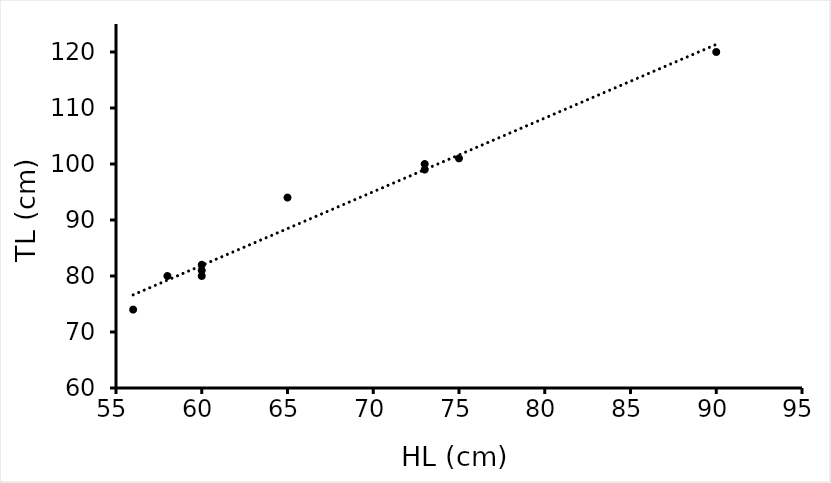
| Category | TL |
|---|---|
| 75.0 | 101 |
| 73.0 | 99 |
| 73.0 | 100 |
| 65.0 | 94 |
| 56.0 | 74 |
| 90.0 | 120 |
| 58.0 | 80 |
| 60.0 | 80 |
| 60.0 | 82 |
| 60.0 | 81 |